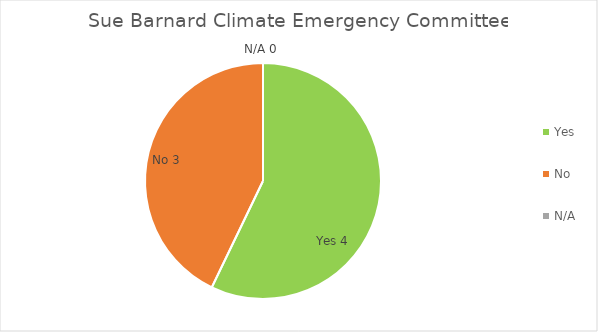
| Category | Sue Barnard |
|---|---|
| Yes | 4 |
| No | 3 |
| N/A | 0 |